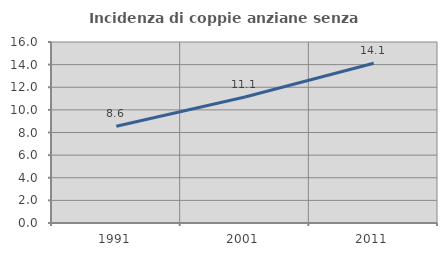
| Category | Incidenza di coppie anziane senza figli  |
|---|---|
| 1991.0 | 8.55 |
| 2001.0 | 11.14 |
| 2011.0 | 14.122 |